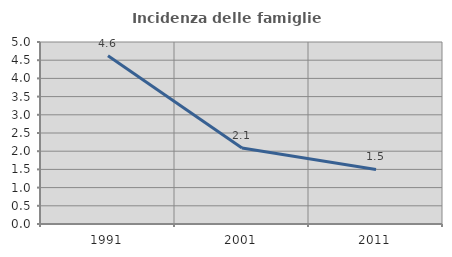
| Category | Incidenza delle famiglie numerose |
|---|---|
| 1991.0 | 4.62 |
| 2001.0 | 2.085 |
| 2011.0 | 1.499 |